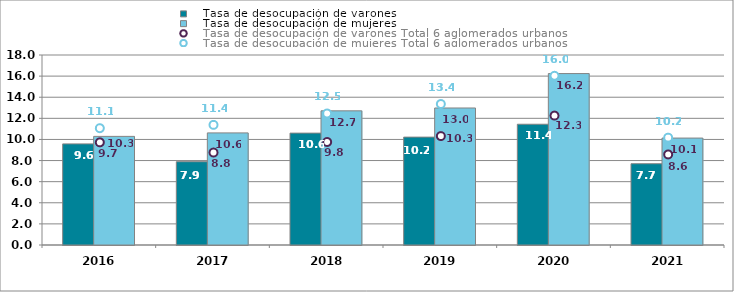
| Category |    Tasa de desocupación de varones |    Tasa de desocupación de mujeres |
|---|---|---|
| 2016.0 | 9.58 | 10.29 |
| 2017.0 | 7.89 | 10.62 |
| 2018.0 | 10.6 | 12.71 |
| 2019.0 | 10.22 | 12.98 |
| 2020.0 | 11.44 | 16.24 |
| 2021.0 | 7.7 | 10.13 |